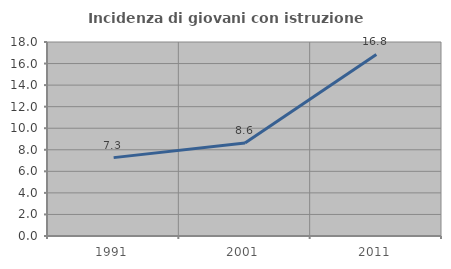
| Category | Incidenza di giovani con istruzione universitaria |
|---|---|
| 1991.0 | 7.273 |
| 2001.0 | 8.621 |
| 2011.0 | 16.842 |